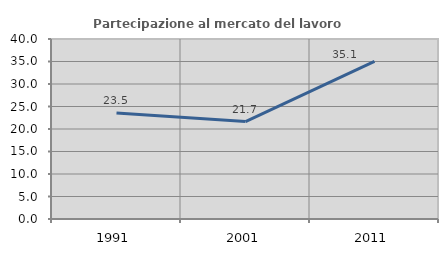
| Category | Partecipazione al mercato del lavoro  femminile |
|---|---|
| 1991.0 | 23.529 |
| 2001.0 | 21.655 |
| 2011.0 | 35.052 |